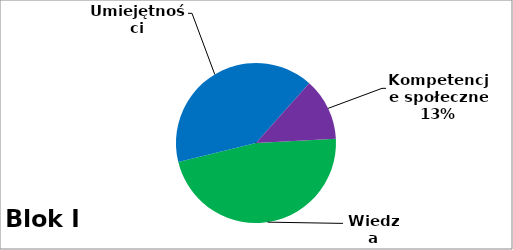
| Category | Series 0 |
|---|---|
| 0 | 142 |
| 1 | 122 |
| 2 | 38 |